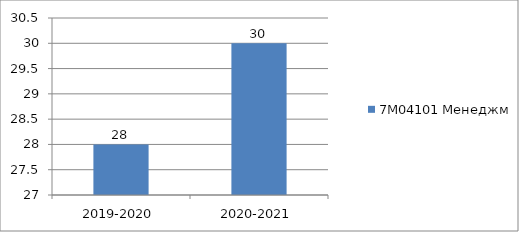
| Category | 7М04101 Менеджмент |
|---|---|
| 	2019-2020 | 28 |
| 	2020-2021 | 30 |